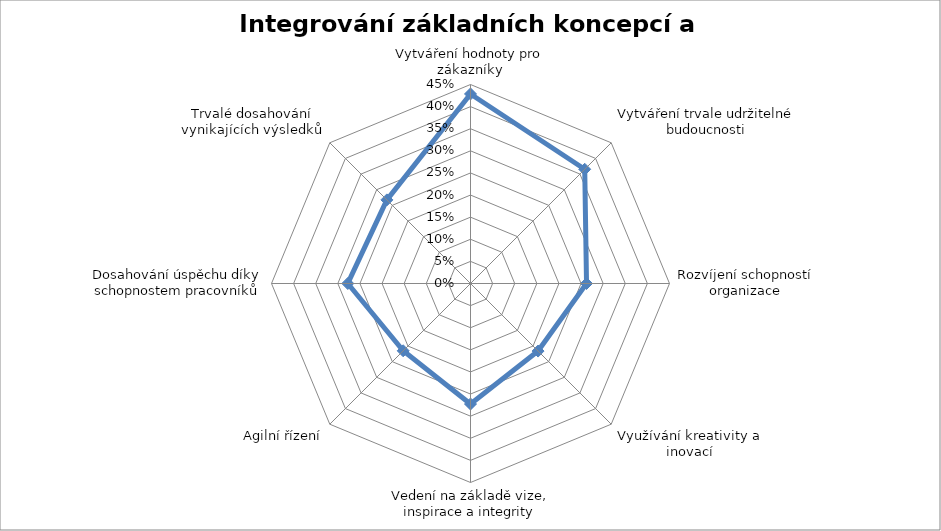
| Category | Integrování základních koncepcí a kritérií |
|---|---|
| Vytváření hodnoty pro zákazníky | 0.429 |
| Vytváření trvale udržitelné budoucnosti | 0.365 |
| Rozvíjení schopností organizace | 0.262 |
| Využívání kreativity a inovací | 0.216 |
| Vedení na základě vize, inspirace a integrity | 0.272 |
| Agilní řízení | 0.215 |
| Dosahování úspěchu díky schopnostem pracovníků | 0.278 |
| Trvalé dosahování vynikajících výsledků | 0.267 |